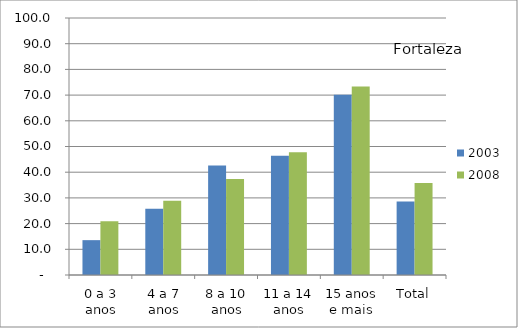
| Category | 2003 | 2008 |
|---|---|---|
| 0 a 3 anos | 13.56 | 20.88 |
| 4 a 7 anos | 25.74 | 28.93 |
| 8 a 10 anos | 42.57 | 37.34 |
| 11 a 14 anos | 46.44 | 47.72 |
| 15 anos e mais | 70.15 | 73.39 |
| Total | 28.64 | 35.82 |